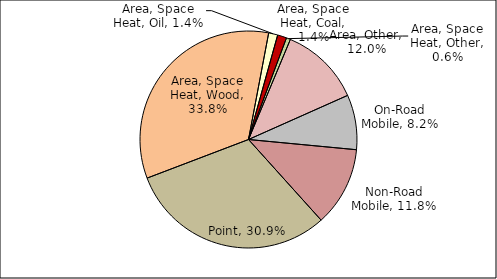
| Category | Series 0 |
|---|---|
| Point | 0.309 |
| Area, Space Heat, Wood | 0.338 |
| Area, Space Heat, Oil | 0.014 |
| Area, Space Heat, Coal | 0.014 |
| Area, Space Heat, Other | 0.006 |
| Area, Other | 0.12 |
| On-Road Mobile | 0.082 |
| Non-Road Mobile | 0.118 |